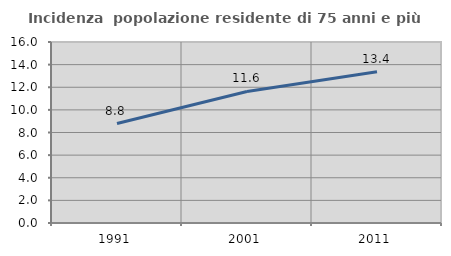
| Category | Incidenza  popolazione residente di 75 anni e più |
|---|---|
| 1991.0 | 8.795 |
| 2001.0 | 11.631 |
| 2011.0 | 13.362 |